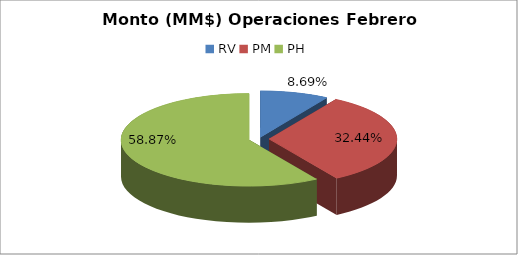
| Category | Series 0 |
|---|---|
| RV | 1189463.212 |
| PM | 4440910.02 |
| PH | 8058380.739 |